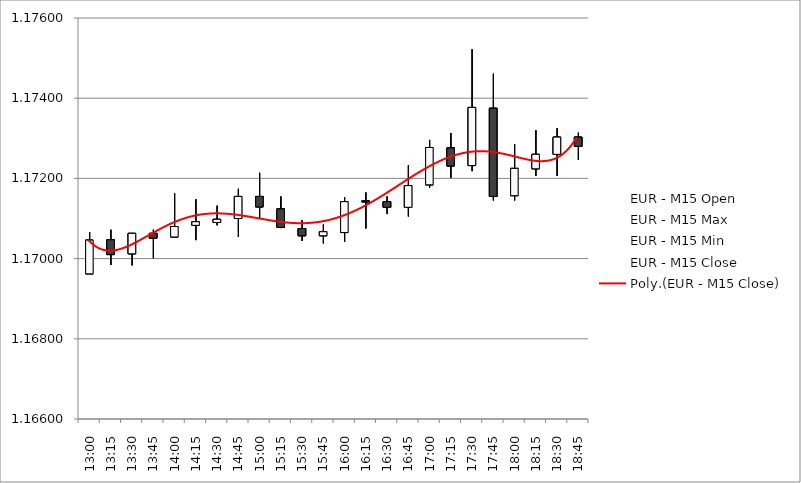
| Category | EUR - M15 Open | EUR - M15 Max | EUR - M15 Min | EUR - M15 Close |
|---|---|---|---|---|
| 0.5416666666666666 | 1.17 | 1.171 | 1.17 | 1.17 |
| 0.5520833333333334 | 1.17 | 1.171 | 1.17 | 1.17 |
| 0.5625 | 1.17 | 1.171 | 1.17 | 1.171 |
| 0.5729166666666666 | 1.171 | 1.171 | 1.17 | 1.171 |
| 0.5833333333333334 | 1.171 | 1.172 | 1.171 | 1.171 |
| 0.59375 | 1.171 | 1.171 | 1.17 | 1.171 |
| 0.6041666666666666 | 1.171 | 1.171 | 1.171 | 1.171 |
| 0.6145833333333334 | 1.171 | 1.172 | 1.171 | 1.172 |
| 0.625 | 1.172 | 1.172 | 1.171 | 1.171 |
| 0.6354166666666666 | 1.171 | 1.172 | 1.171 | 1.171 |
| 0.6458333333333334 | 1.171 | 1.171 | 1.17 | 1.171 |
| 0.65625 | 1.171 | 1.171 | 1.17 | 1.171 |
| 0.6666666666666666 | 1.171 | 1.172 | 1.17 | 1.171 |
| 0.6770833333333334 | 1.171 | 1.172 | 1.171 | 1.171 |
| 0.6875 | 1.171 | 1.172 | 1.171 | 1.171 |
| 0.6979166666666666 | 1.171 | 1.172 | 1.171 | 1.172 |
| 0.7083333333333334 | 1.172 | 1.173 | 1.172 | 1.173 |
| 0.71875 | 1.173 | 1.173 | 1.172 | 1.172 |
| 0.7291666666666666 | 1.172 | 1.175 | 1.172 | 1.174 |
| 0.7395833333333334 | 1.174 | 1.175 | 1.171 | 1.172 |
| 0.75 | 1.172 | 1.173 | 1.171 | 1.172 |
| 0.7604166666666666 | 1.172 | 1.173 | 1.172 | 1.173 |
| 0.7708333333333334 | 1.173 | 1.173 | 1.172 | 1.173 |
| 0.78125 | 1.173 | 1.173 | 1.172 | 1.173 |